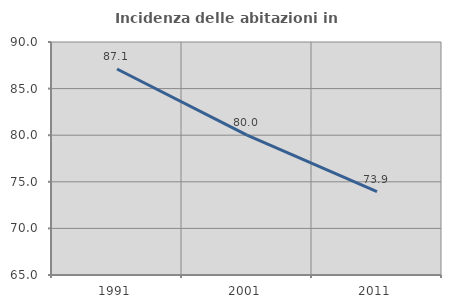
| Category | Incidenza delle abitazioni in proprietà  |
|---|---|
| 1991.0 | 87.107 |
| 2001.0 | 80 |
| 2011.0 | 73.95 |